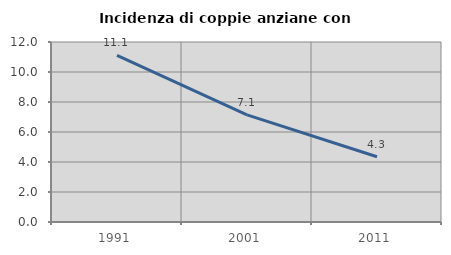
| Category | Incidenza di coppie anziane con figli |
|---|---|
| 1991.0 | 11.111 |
| 2001.0 | 7.143 |
| 2011.0 | 4.348 |